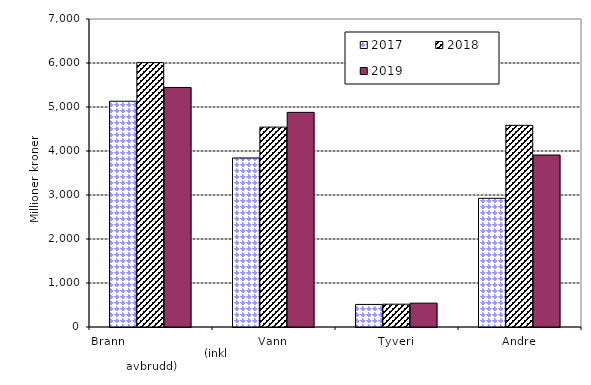
| Category | 2017 | 2018 | 2019 |
|---|---|---|---|
| Brann                                                       (inkl avbrudd) | 5130.97 | 6008.519 | 5443.964 |
| Vann | 3842.246 | 4542.79 | 4878.204 |
| Tyveri | 513.098 | 518.484 | 541.962 |
| Andre | 2924.613 | 4583.442 | 3908.174 |